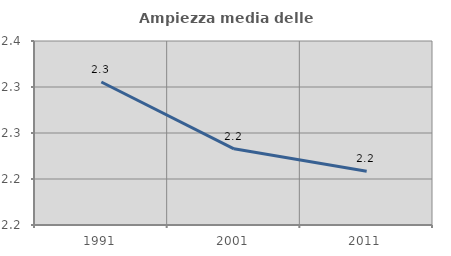
| Category | Ampiezza media delle famiglie |
|---|---|
| 1991.0 | 2.305 |
| 2001.0 | 2.233 |
| 2011.0 | 2.208 |